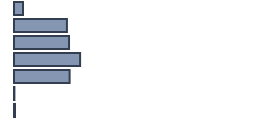
| Category | Percentatge |
|---|---|
| 0 | 3.706 |
| 1 | 22.055 |
| 2 | 22.929 |
| 3 | 27.546 |
| 4 | 23.172 |
| 5 | 0.167 |
| 6 | 0.426 |